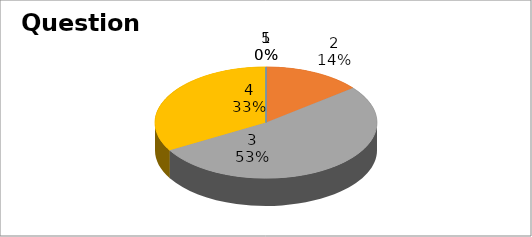
| Category | Series 0 |
|---|---|
| 0 | 0 |
| 1 | 3 |
| 2 | 11 |
| 3 | 7 |
| 4 | 0 |